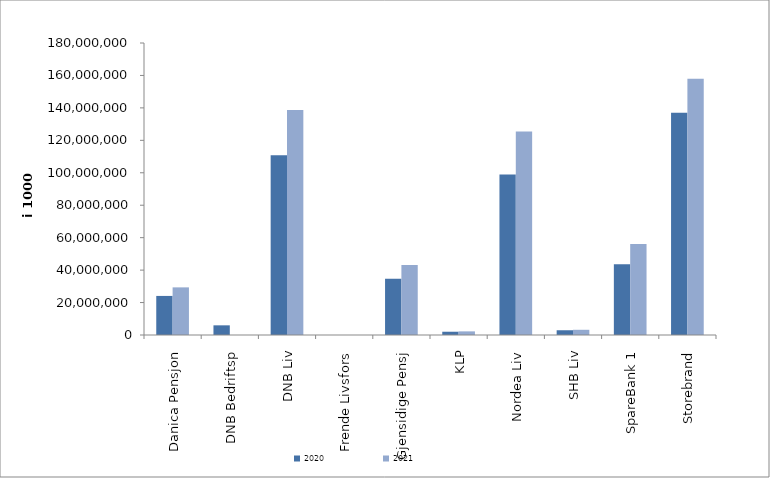
| Category | 2020 | 2021 |
|---|---|---|
| Danica Pensjon | 24084123.675 | 29361437.74 |
| DNB Bedriftsp | 5959168 | 0 |
| DNB Liv | 110860381.591 | 138747409.081 |
| Frende Livsfors | 0 | 0 |
| Gjensidige Pensj | 34697528 | 43184431 |
| KLP | 2013752.242 | 2234333.468 |
| Nordea Liv | 98862690 | 125405208.52 |
| SHB Liv | 2931716.441 | 3211246.306 |
| SpareBank 1 | 43584932.28 | 56140255.507 |
| Storebrand | 137052793.507 | 157892391.242 |